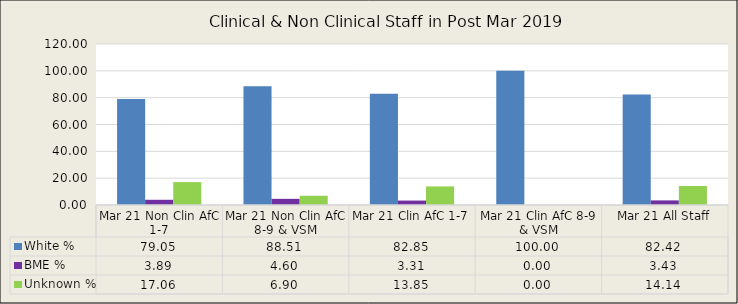
| Category | White % | BME % | Unknown % |
|---|---|---|---|
| Mar 21 Non Clin AfC 1-7 | 79.05 | 3.888 | 17.063 |
| Mar 21 Non Clin AfC 8-9 & VSM | 88.506 | 4.598 | 6.897 |
| Mar 21 Clin AfC 1-7 | 82.848 | 3.306 | 13.846 |
| Mar 21 Clin AfC 8-9 & VSM | 100 | 0 | 0 |
| Mar 21 All Staff | 82.424 | 3.434 | 14.141 |